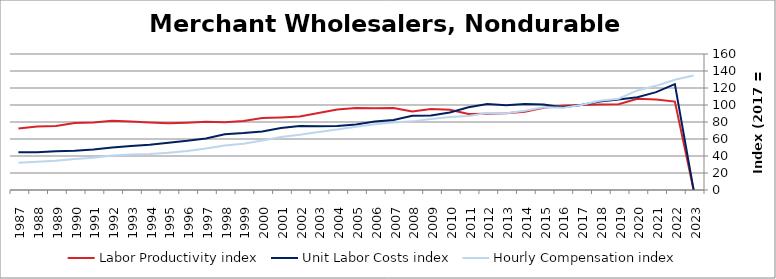
| Category | Labor Productivity index | Unit Labor Costs index | Hourly Compensation index |
|---|---|---|---|
| 2023.0 | 0 | 0 | 134.707 |
| 2022.0 | 104.025 | 124.614 | 129.629 |
| 2021.0 | 106.41 | 115.165 | 122.547 |
| 2020.0 | 107.402 | 109.081 | 117.155 |
| 2019.0 | 100.896 | 106.495 | 107.449 |
| 2018.0 | 100.706 | 104.14 | 104.875 |
| 2017.0 | 100 | 100 | 100 |
| 2016.0 | 99.19 | 97.409 | 96.621 |
| 2015.0 | 96.802 | 100.615 | 97.397 |
| 2014.0 | 92.112 | 101.301 | 93.311 |
| 2013.0 | 90.381 | 99.791 | 90.192 |
| 2012.0 | 89.7 | 101.101 | 90.688 |
| 2011.0 | 89.43 | 97.45 | 87.149 |
| 2010.0 | 94.36 | 91.153 | 86.012 |
| 2009.0 | 95.336 | 87.75 | 83.657 |
| 2008.0 | 92.34 | 87.437 | 80.739 |
| 2007.0 | 96.525 | 82.386 | 79.524 |
| 2006.0 | 96.084 | 80.452 | 77.302 |
| 2005.0 | 96.456 | 77.126 | 74.393 |
| 2004.0 | 94.642 | 75.242 | 71.211 |
| 2003.0 | 90.679 | 75.141 | 68.137 |
| 2002.0 | 86.377 | 75.178 | 64.936 |
| 2001.0 | 85.384 | 72.981 | 62.314 |
| 2000.0 | 84.682 | 68.871 | 58.321 |
| 1999.0 | 81.236 | 67.035 | 54.457 |
| 1998.0 | 79.606 | 65.696 | 52.298 |
| 1997.0 | 80.345 | 60.692 | 48.763 |
| 1996.0 | 79.255 | 57.9 | 45.889 |
| 1995.0 | 78.588 | 55.605 | 43.699 |
| 1994.0 | 79.441 | 53.339 | 42.373 |
| 1993.0 | 80.546 | 51.782 | 41.708 |
| 1992.0 | 81.537 | 49.945 | 40.724 |
| 1991.0 | 79.376 | 47.733 | 37.888 |
| 1990.0 | 78.849 | 46.302 | 36.508 |
| 1989.0 | 75.264 | 45.718 | 34.41 |
| 1988.0 | 74.776 | 44.399 | 33.2 |
| 1987.0 | 72.347 | 44.369 | 32.1 |